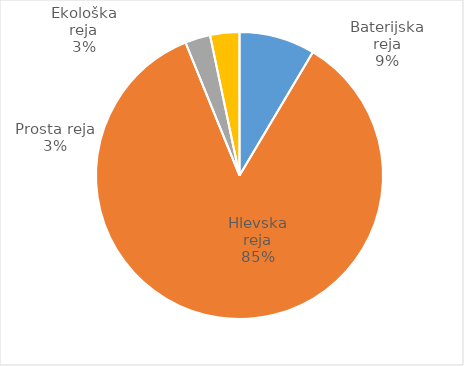
| Category | Število kosov jajc |
|---|---|
| Baterijska reja | 268961 |
| Hlevska reja | 2688483 |
| Prosta reja | 89574 |
| Ekološka reja | 103914 |